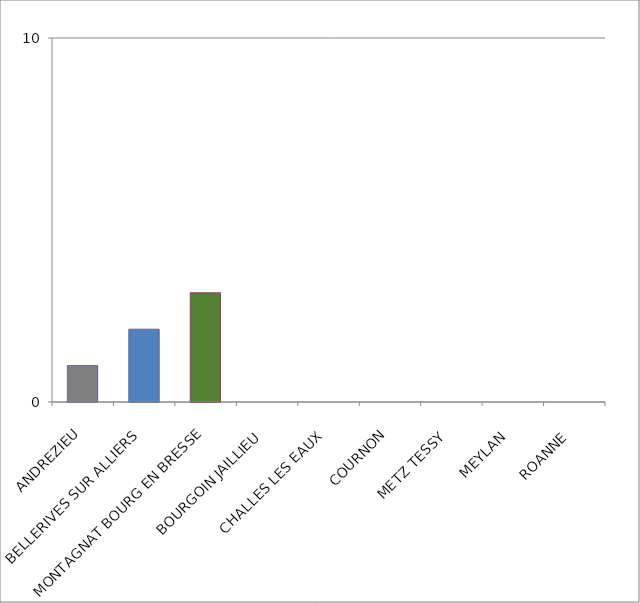
| Category | Series 0 |
|---|---|
| ANDREZIEU | 1 |
| BELLERIVES SUR ALLIERS  | 2 |
| MONTAGNAT BOURG EN BRESSE | 3 |
| BOURGOIN JAILLIEU  | 0 |
| CHALLES LES EAUX  | 0 |
| COURNON | 0 |
| METZ TESSY  | 0 |
| MEYLAN  | 0 |
| ROANNE  | 0 |